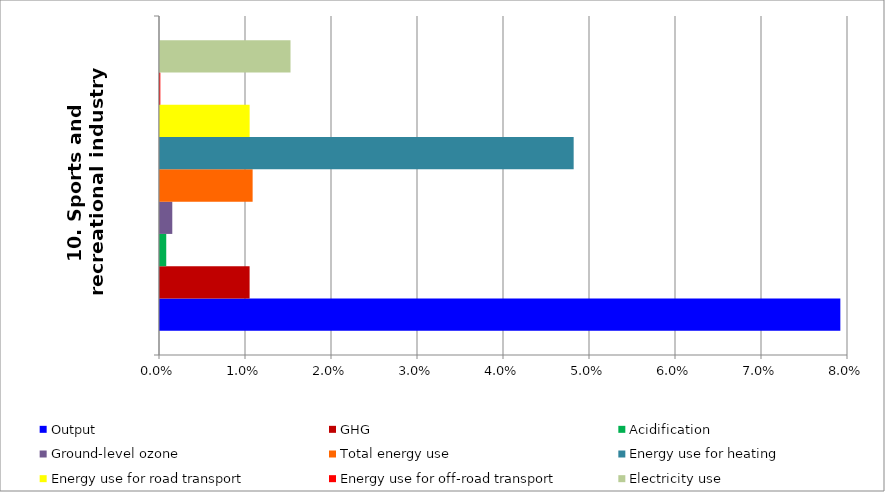
| Category | Output | GHG | Acidification | Ground-level ozone | Total energy use | Energy use for heating | Energy use for road transport | Energy use for off-road transport | Electricity use |
|---|---|---|---|---|---|---|---|---|---|
| 10. Sports and recreational industry | 0.079 | 0.01 | 0.001 | 0.001 | 0.011 | 0.048 | 0.01 | 0 | 0.015 |